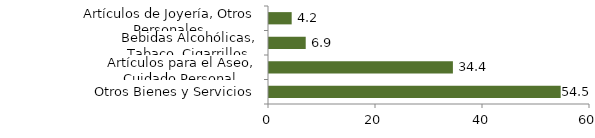
| Category | Otros grupos |
|---|---|
| Otros Bienes y Servicios | 54.52 |
| Artículos para el Aseo, Cuidado Personal | 34.376 |
| Bebidas Alcohólicas, Tabaco, Cigarrillos | 6.863 |
| Artículos de Joyería, Otros Personales | 4.24 |